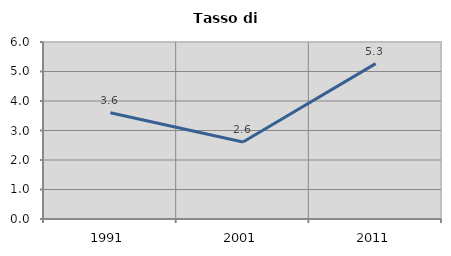
| Category | Tasso di disoccupazione   |
|---|---|
| 1991.0 | 3.599 |
| 2001.0 | 2.607 |
| 2011.0 | 5.267 |